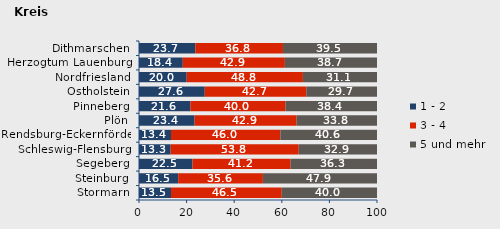
| Category | 1 - 2 | 3 - 4 | 5 und mehr |
|---|---|---|---|
| Stormarn | 13.455 | 46.522 | 40.023 |
| Steinburg | 16.471 | 35.588 | 47.941 |
| Segeberg | 22.476 | 41.246 | 36.278 |
| Schleswig-Flensburg | 13.287 | 53.84 | 32.873 |
| Rendsburg-Eckernförde | 13.436 | 45.969 | 40.595 |
| Plön | 23.355 | 42.887 | 33.758 |
| Pinneberg | 21.603 | 40 | 38.397 |
| Ostholstein | 27.63 | 42.659 | 29.711 |
| Nordfriesland | 20.044 | 48.825 | 31.131 |
| Herzogtum Lauenburg | 18.401 | 42.893 | 38.706 |
| Dithmarschen | 23.659 | 36.829 | 39.512 |